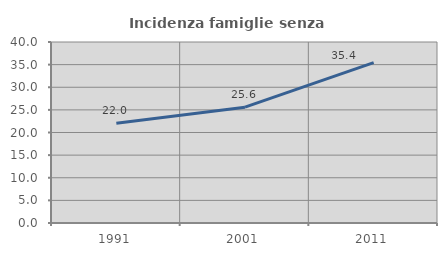
| Category | Incidenza famiglie senza nuclei |
|---|---|
| 1991.0 | 22.039 |
| 2001.0 | 25.6 |
| 2011.0 | 35.45 |